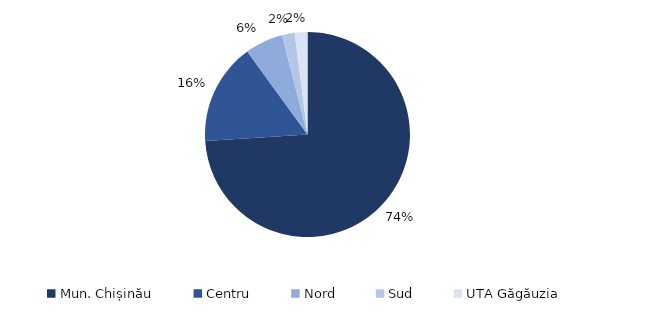
| Category | Series 0 |
|---|---|
| Mun. Chișinău | 0.74 |
| Centru | 0.16 |
| Nord | 0.06 |
| Sud | 0.02 |
| UTA Găgăuzia | 0.02 |